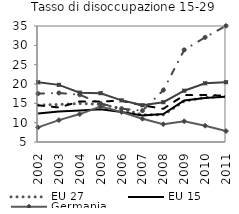
| Category | EU 27 | EU 15 | Germania | Spagna | Francia | Italia |
|---|---|---|---|---|---|---|
| 2002.0 | 14.542 | 12.35 | 8.788 | 17.516 | 14.491 | 20.436 |
| 2003.0 | 14.699 | 12.898 | 10.658 | 17.68 | 13.932 | 19.778 |
| 2004.0 | 14.959 | 13.166 | 12.219 | 17.211 | 15.483 | 17.756 |
| 2005.0 | 14.768 | 13.48 | 14.184 | 14.944 | 15.498 | 17.624 |
| 2006.0 | 13.555 | 12.776 | 12.755 | 13.623 | 15.651 | 15.772 |
| 2007.0 | 12.034 | 11.853 | 11.022 | 13.099 | 14.487 | 14.513 |
| 2008.0 | 12.021 | 12.244 | 9.587 | 18.414 | 13.585 | 15.293 |
| 2009.0 | 15.555 | 15.743 | 10.359 | 28.825 | 17.126 | 18.269 |
| 2010.0 | 16.558 | 16.394 | 9.209 | 32.059 | 17.157 | 20.188 |
| 2011.0 | 16.783 | 16.691 | 7.835 | 35.044 | 16.971 | 20.466 |